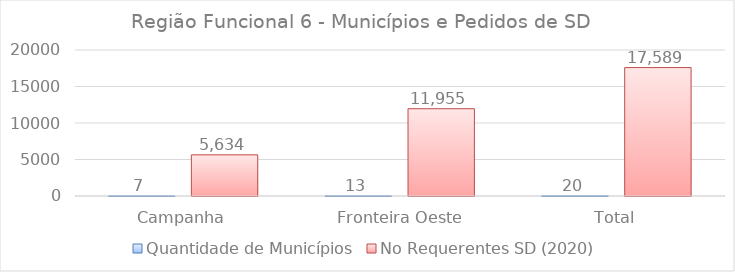
| Category | Quantidade de Municípios | No Requerentes SD (2020) |
|---|---|---|
| Campanha | 7 | 5634 |
|  Fronteira Oeste | 13 | 11955 |
| Total | 20 | 17589 |